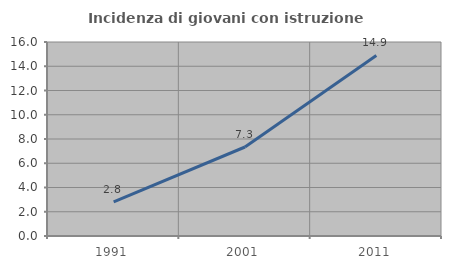
| Category | Incidenza di giovani con istruzione universitaria |
|---|---|
| 1991.0 | 2.817 |
| 2001.0 | 7.339 |
| 2011.0 | 14.894 |